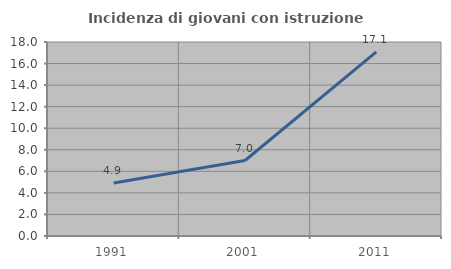
| Category | Incidenza di giovani con istruzione universitaria |
|---|---|
| 1991.0 | 4.918 |
| 2001.0 | 7.004 |
| 2011.0 | 17.081 |